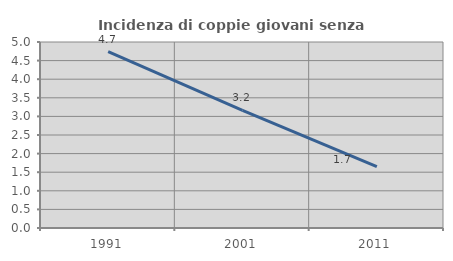
| Category | Incidenza di coppie giovani senza figli |
|---|---|
| 1991.0 | 4.74 |
| 2001.0 | 3.165 |
| 2011.0 | 1.653 |